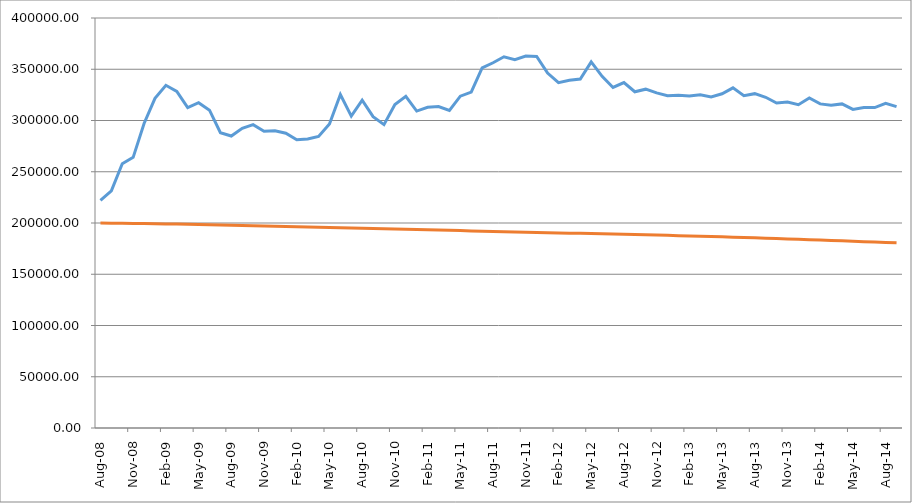
| Category | Series 0 | Series 1 |
|---|---|---|
| 2008-08-01 | 222165.553 | 200000 |
| 2008-09-01 | 231291.088 | 199861.664 |
| 2008-10-01 | 257786.427 | 199722.422 |
| 2008-11-01 | 264052.226 | 199581.706 |
| 2008-12-01 | 297087.375 | 199440.072 |
| 2009-01-01 | 321548.973 | 199297.513 |
| 2009-02-01 | 334331.408 | 199131.234 |
| 2009-03-01 | 328325.458 | 198963.973 |
| 2009-04-01 | 312598.249 | 198795.725 |
| 2009-05-01 | 317359.511 | 198562.523 |
| 2009-06-01 | 310045.783 | 198328.277 |
| 2009-07-01 | 288146.118 | 198092.983 |
| 2009-08-01 | 284848.649 | 197867.928 |
| 2009-09-01 | 292329.054 | 197641.816 |
| 2009-10-01 | 295914.098 | 197414.641 |
| 2009-11-01 | 289506.154 | 197175.493 |
| 2009-12-01 | 289913.915 | 196935.273 |
| 2010-01-01 | 287614.18 | 196693.976 |
| 2010-02-01 | 281137.741 | 196455.431 |
| 2010-03-01 | 282025.688 | 196215.799 |
| 2010-04-01 | 284424.123 | 195975.075 |
| 2010-05-01 | 296644.199 | 195725.947 |
| 2010-06-01 | 325284.259 | 195475.719 |
| 2010-07-01 | 304305.305 | 195224.385 |
| 2010-08-01 | 319838.514 | 194961.748 |
| 2010-09-01 | 303778.33 | 194698.001 |
| 2010-10-01 | 296004.161 | 194433.139 |
| 2010-11-01 | 315542.366 | 194165.802 |
| 2010-12-01 | 323552.966 | 193897.342 |
| 2011-01-01 | 309174.058 | 193627.754 |
| 2011-02-01 | 312824.636 | 193361.992 |
| 2011-03-01 | 313575.604 | 193095.089 |
| 2011-04-01 | 309830.857 | 192827.041 |
| 2011-05-01 | 323714.095 | 192568.429 |
| 2011-06-01 | 327628.208 | 192308.656 |
| 2011-07-01 | 351322.543 | 192047.716 |
| 2011-08-01 | 356349.056 | 191806.643 |
| 2011-09-01 | 362193.747 | 191564.386 |
| 2011-10-01 | 359320.263 | 191320.941 |
| 2011-11-01 | 362912.3 | 191079.143 |
| 2011-12-01 | 362546.948 | 190836.145 |
| 2012-01-01 | 346248.14 | 190591.94 |
| 2012-02-01 | 336910.939 | 190355.709 |
| 2012-03-01 | 339216.781 | 190118.26 |
| 2012-04-01 | 340485.349 | 189879.586 |
| 2012-05-01 | 357104.013 | 189637.699 |
| 2012-06-01 | 343078.731 | 189394.576 |
| 2012-07-01 | 332263.014 | 189150.208 |
| 2012-08-01 | 337022.129 | 188912.078 |
| 2012-09-01 | 328036.056 | 188672.691 |
| 2012-10-01 | 330559.437 | 188432.042 |
| 2012-11-01 | 326973.269 | 188181.802 |
| 2012-12-01 | 324216.653 | 187930.286 |
| 2013-01-01 | 324667.411 | 187677.487 |
| 2013-02-01 | 323989.095 | 187389.882 |
| 2013-03-01 | 325108.677 | 187101 |
| 2013-04-01 | 322996.511 | 186810.834 |
| 2013-05-01 | 326043.938 | 186510.341 |
| 2013-06-01 | 331845.844 | 186208.563 |
| 2013-07-01 | 324233.486 | 185905.495 |
| 2013-08-01 | 326191.871 | 185542.133 |
| 2013-09-01 | 322671.93 | 185177.581 |
| 2013-10-01 | 317035.61 | 184811.834 |
| 2013-11-01 | 317982.83 | 184441.729 |
| 2013-12-01 | 315407.341 | 184070.43 |
| 2014-01-01 | 321936.582 | 183697.933 |
| 2014-02-01 | 316220.93 | 183326.342 |
| 2014-03-01 | 314786.781 | 182953.539 |
| 2014-04-01 | 316192.529 | 182579.522 |
| 2014-05-01 | 310798.04 | 182204.286 |
| 2014-06-01 | 312715.219 | 181827.828 |
| 2014-07-01 | 312566.438 | 181450.143 |
| 2014-08-01 | 316750.59 | 181069.655 |
| 2014-09-01 | 313535.57 | 180687.936 |